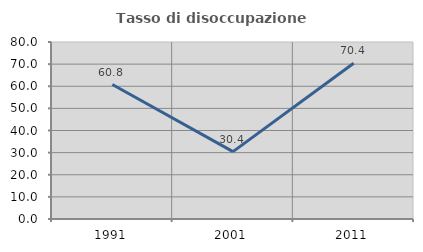
| Category | Tasso di disoccupazione giovanile  |
|---|---|
| 1991.0 | 60.784 |
| 2001.0 | 30.435 |
| 2011.0 | 70.37 |